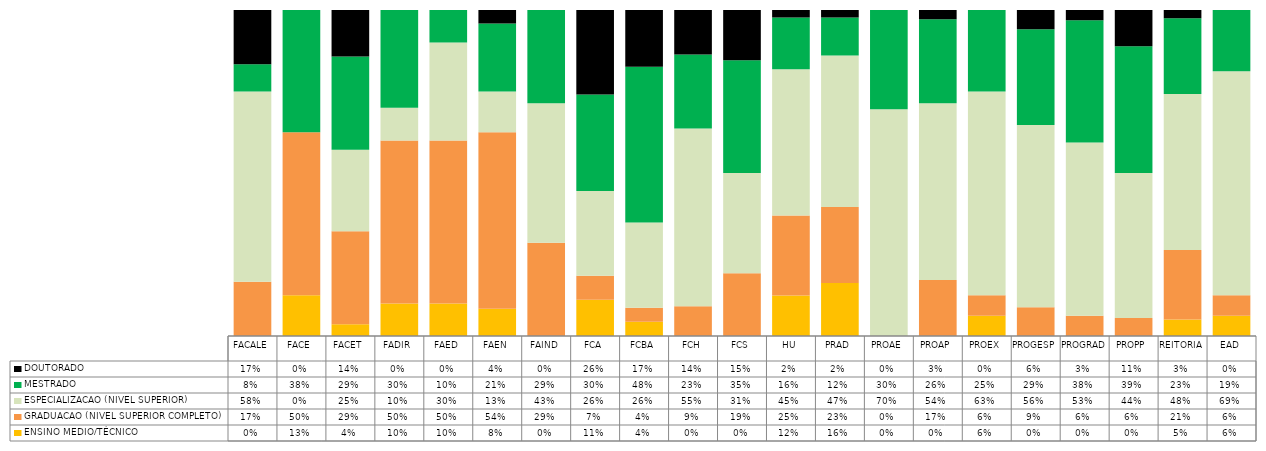
| Category | ENSINO MEDIO/TÉCNICO | GRADUACAO (NIVEL SUPERIOR COMPLETO) | ESPECIALIZACAO (NIVEL SUPERIOR)   | MESTRADO | DOUTORADO                             |
|---|---|---|---|---|---|
| FACALE | 0 | 0.167 | 0.583 | 0.083 | 0.167 |
| FACE | 0.125 | 0.5 | 0 | 0.375 | 0 |
| FACET | 0.036 | 0.286 | 0.25 | 0.286 | 0.143 |
| FADIR | 0.1 | 0.5 | 0.1 | 0.3 | 0 |
| FAED | 0.1 | 0.5 | 0.3 | 0.1 | 0 |
| FAEN | 0.083 | 0.542 | 0.125 | 0.208 | 0.042 |
| FAIND | 0 | 0.286 | 0.429 | 0.286 | 0 |
| FCA | 0.111 | 0.074 | 0.259 | 0.296 | 0.259 |
| FCBA | 0.043 | 0.043 | 0.261 | 0.478 | 0.174 |
| FCH | 0 | 0.091 | 0.545 | 0.227 | 0.136 |
| FCS | 0 | 0.192 | 0.308 | 0.346 | 0.154 |
| HU | 0.124 | 0.246 | 0.448 | 0.159 | 0.023 |
| PRAD | 0.163 | 0.233 | 0.465 | 0.116 | 0.023 |
| PROAE | 0 | 0 | 0.696 | 0.304 | 0 |
| PROAP | 0 | 0.171 | 0.543 | 0.257 | 0.029 |
| PROEX | 0.062 | 0.062 | 0.625 | 0.25 | 0 |
| PROGESP | 0 | 0.088 | 0.559 | 0.294 | 0.059 |
| PROGRAD | 0 | 0.062 | 0.531 | 0.375 | 0.031 |
| PROPP | 0 | 0.056 | 0.444 | 0.389 | 0.111 |
| REITORIA | 0.05 | 0.214 | 0.478 | 0.233 | 0.025 |
| EAD | 0.062 | 0.062 | 0.688 | 0.188 | 0 |